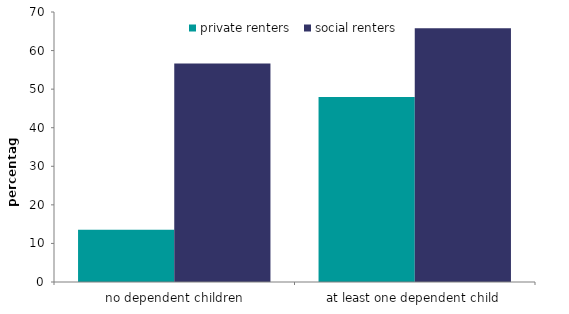
| Category | private renters | social renters |
|---|---|---|
| no dependent children | 13.539 | 56.626 |
| at least one dependent child | 47.941 | 65.772 |